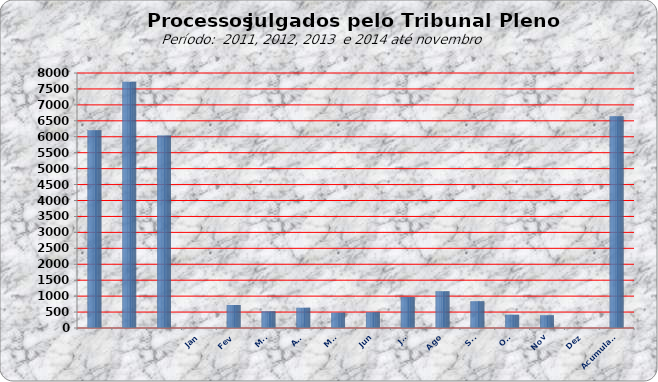
| Category | 6205 7722 6043 0 721 524 638 481 496 969 1152 842 419 399 0 |
|---|---|
|  | 6205 |
|  | 7722 |
|  | 6043 |
| Jan | 0 |
| Fev | 721 |
| Mar | 524 |
| Abr | 638 |
| Mai | 481 |
| Jun | 496 |
| Jul | 969 |
| Ago | 1152 |
| Set | 842 |
| Out | 419 |
| Nov | 399 |
| Dez | 0 |
| Acumulado | 6641 |